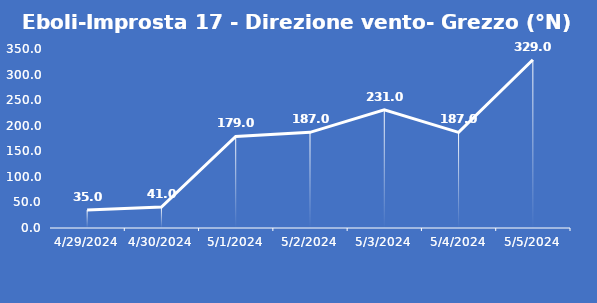
| Category | Eboli-Improsta 17 - Direzione vento- Grezzo (°N) |
|---|---|
| 4/29/24 | 35 |
| 4/30/24 | 41 |
| 5/1/24 | 179 |
| 5/2/24 | 187 |
| 5/3/24 | 231 |
| 5/4/24 | 187 |
| 5/5/24 | 329 |